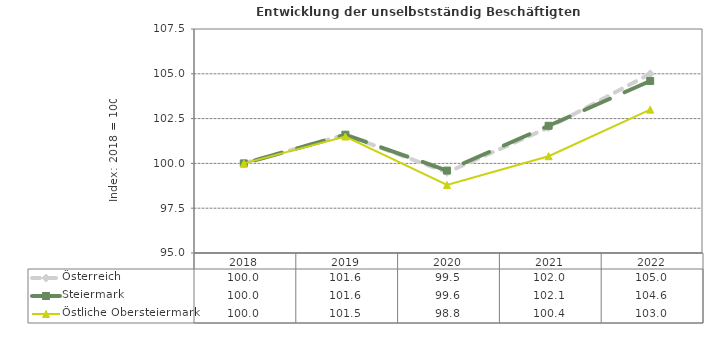
| Category | Österreich | Steiermark | Östliche Obersteiermark |
|---|---|---|---|
| 2022.0 | 105 | 104.6 | 103 |
| 2021.0 | 102 | 102.1 | 100.4 |
| 2020.0 | 99.5 | 99.6 | 98.8 |
| 2019.0 | 101.6 | 101.6 | 101.5 |
| 2018.0 | 100 | 100 | 100 |